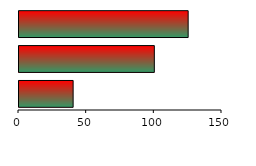
| Category | DPTO | Casa pareada | Casa aislada |
|---|---|---|---|
| 0 | 40 | 100 | 125 |